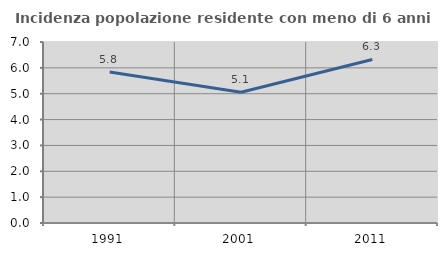
| Category | Incidenza popolazione residente con meno di 6 anni |
|---|---|
| 1991.0 | 5.839 |
| 2001.0 | 5.055 |
| 2011.0 | 6.326 |